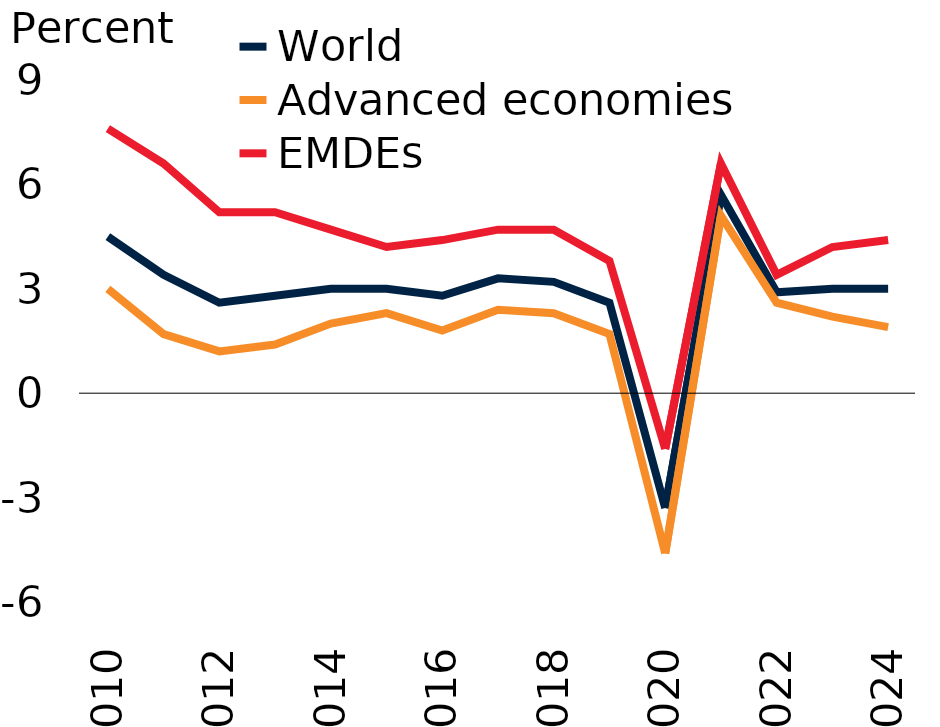
| Category | World | Advanced economies | EMDEs |
|---|---|---|---|
| 2010.0 | 4.5 | 3 | 7.6 |
| 2011.0 | 3.4 | 1.7 | 6.6 |
| 2012.0 | 2.6 | 1.2 | 5.2 |
| 2013.0 | 2.8 | 1.4 | 5.2 |
| 2014.0 | 3 | 2 | 4.7 |
| 2015.0 | 3 | 2.3 | 4.2 |
| 2016.0 | 2.8 | 1.8 | 4.4 |
| 2017.0 | 3.3 | 2.4 | 4.7 |
| 2018.0 | 3.2 | 2.3 | 4.7 |
| 2019.0 | 2.6 | 1.7 | 3.8 |
| 2020.0 | -3.3 | -4.6 | -1.6 |
| 2021.0 | 5.7 | 5.1 | 6.6 |
| 2022.0 | 2.9 | 2.6 | 3.4 |
| 2023.0 | 3 | 2.2 | 4.2 |
| 2024.0 | 3 | 1.9 | 4.4 |